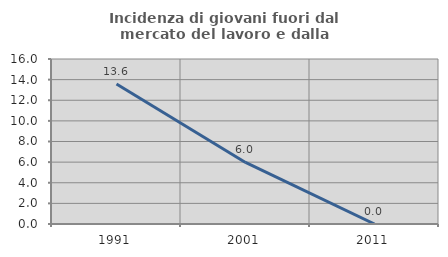
| Category | Incidenza di giovani fuori dal mercato del lavoro e dalla formazione  |
|---|---|
| 1991.0 | 13.58 |
| 2001.0 | 5.97 |
| 2011.0 | 0 |